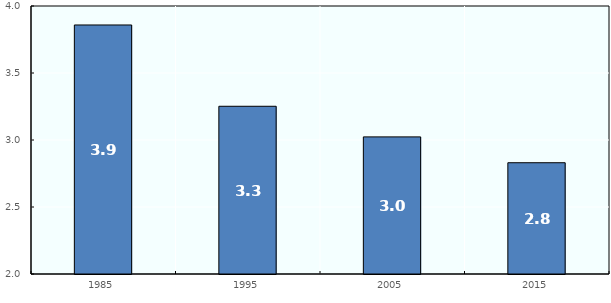
| Category | OECD |
|---|---|
| 1985.0 | 3.858 |
| 1995.0 | 3.252 |
| 2005.0 | 3.023 |
| 2015.0 | 2.83 |